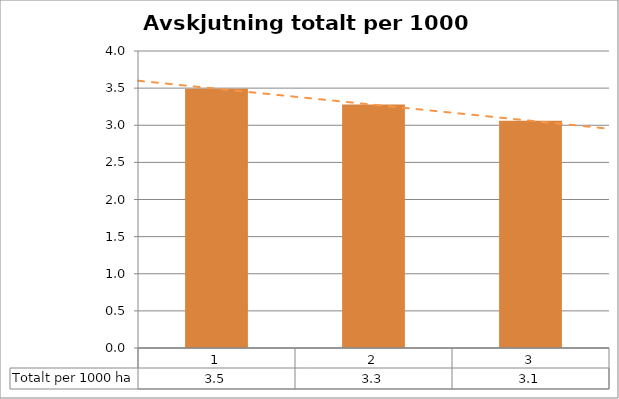
| Category | Totalt per 1000 ha |
|---|---|
| 0 | 3.49 |
| 1 | 3.28 |
| 2 | 3.059 |